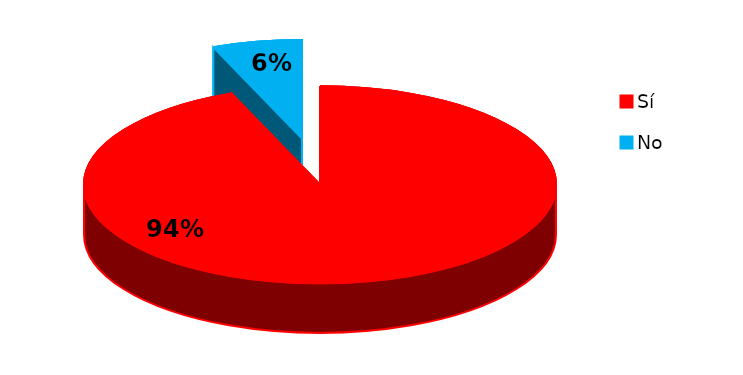
| Category | Series 0 |
|---|---|
| 0 | 46 |
| 1 | 3 |